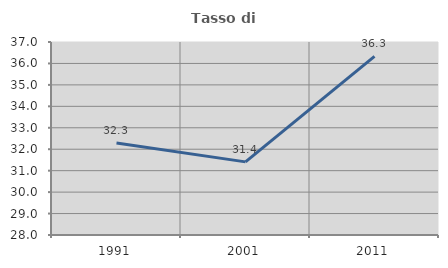
| Category | Tasso di occupazione   |
|---|---|
| 1991.0 | 32.289 |
| 2001.0 | 31.41 |
| 2011.0 | 36.329 |